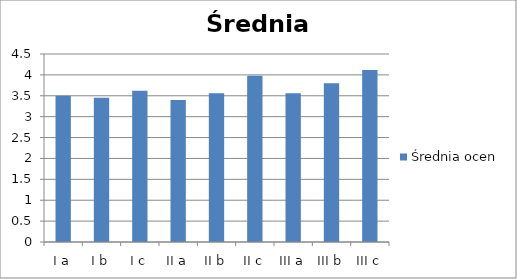
| Category | Średnia ocen |
|---|---|
| I a | 3.5 |
| I b | 3.45 |
| I c | 3.62 |
| II a | 3.4 |
| II b | 3.56 |
| II c | 3.98 |
| III a | 3.56 |
| III b | 3.8 |
| III c | 4.12 |